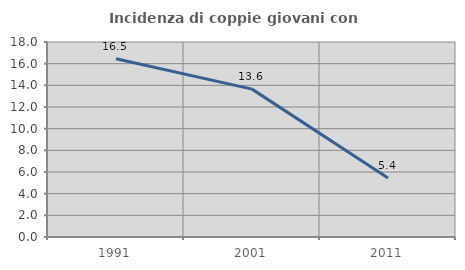
| Category | Incidenza di coppie giovani con figli |
|---|---|
| 1991.0 | 16.452 |
| 2001.0 | 13.65 |
| 2011.0 | 5.45 |